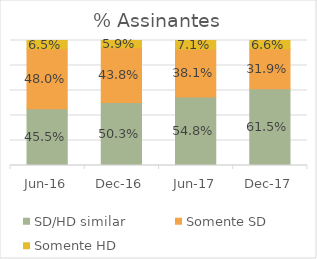
| Category | SD/HD similar | Somente SD  | Somente HD |
|---|---|---|---|
| 2016-06-01 | 0.455 | 0.48 | 0.065 |
| 2016-12-01 | 0.503 | 0.438 | 0.059 |
| 2017-06-01 | 0.548 | 0.381 | 0.071 |
| 2017-12-01 | 0.615 | 0.319 | 0.066 |